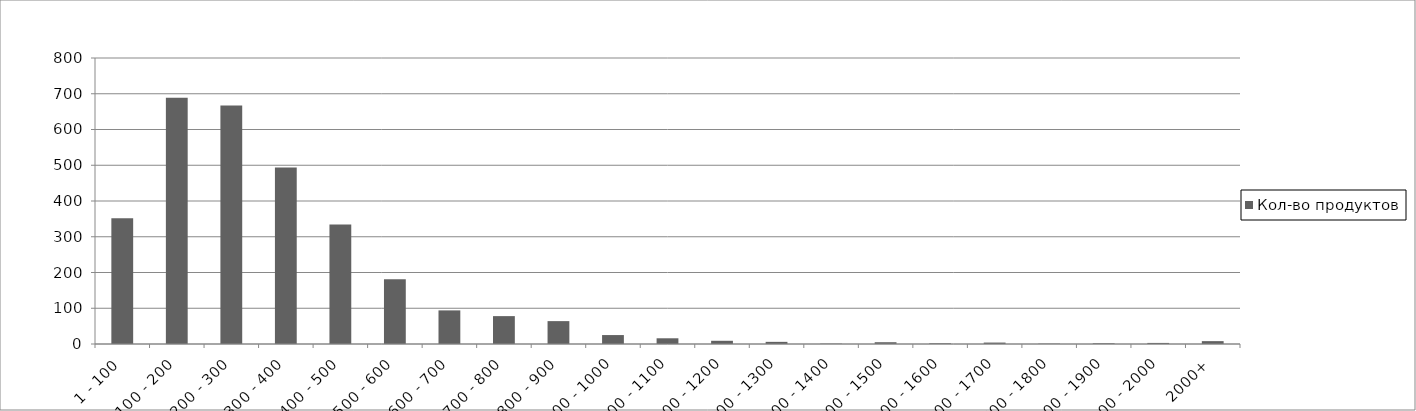
| Category | Кол-во продуктов |
|---|---|
| 1 - 100 | 352 |
| 100 - 200 | 689 |
| 200 - 300 | 667 |
| 300 - 400 | 494 |
| 400 - 500 | 334 |
| 500 - 600 | 181 |
| 600 - 700 | 94 |
| 700 - 800 | 78 |
| 800 - 900 | 64 |
| 900 - 1000 | 25 |
| 1000 - 1100 | 16 |
| 1100 - 1200 | 9 |
| 1200 - 1300 | 6 |
| 1300 - 1400 | 1 |
| 1400 - 1500 | 5 |
| 1500 - 1600 | 2 |
| 1600 - 1700 | 4 |
| 1700 - 1800 | 1 |
| 1800 - 1900 | 2 |
| 1900 - 2000 | 3 |
| 2000+ | 8 |